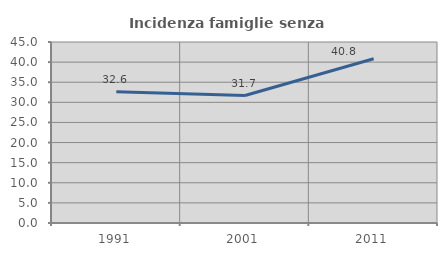
| Category | Incidenza famiglie senza nuclei |
|---|---|
| 1991.0 | 32.633 |
| 2001.0 | 31.686 |
| 2011.0 | 40.838 |